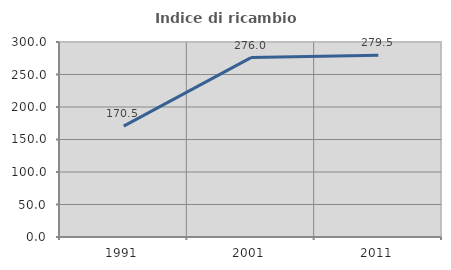
| Category | Indice di ricambio occupazionale  |
|---|---|
| 1991.0 | 170.529 |
| 2001.0 | 276.048 |
| 2011.0 | 279.521 |